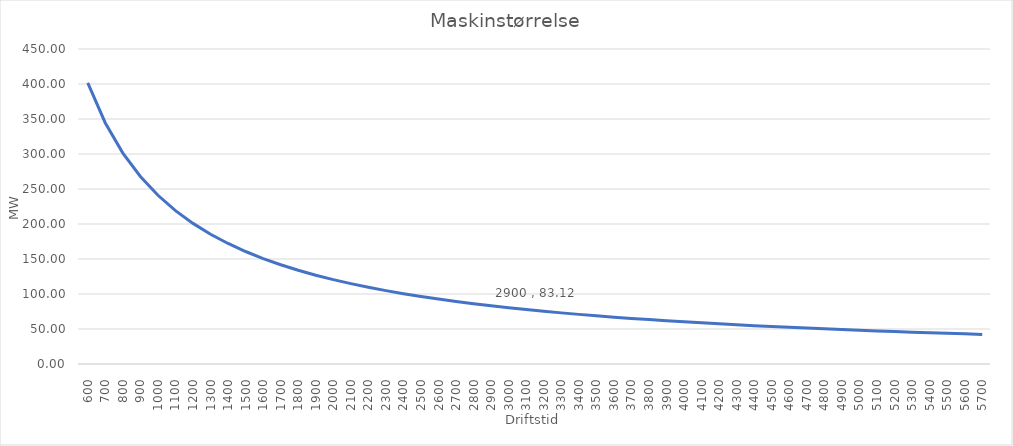
| Category | Maskinstørrelse |
|---|---|
| 600.0 | 401.742 |
| 700.0 | 344.35 |
| 800.0 | 301.306 |
| 900.0 | 267.828 |
| 1000.0 | 241.045 |
| 1100.0 | 219.132 |
| 1200.0 | 200.871 |
| 1300.0 | 185.419 |
| 1400.0 | 172.175 |
| 1500.0 | 160.697 |
| 1600.0 | 150.653 |
| 1700.0 | 141.791 |
| 1800.0 | 133.914 |
| 1900.0 | 126.866 |
| 2000.0 | 120.522 |
| 2100.0 | 114.783 |
| 2200.0 | 109.566 |
| 2300.0 | 104.802 |
| 2400.0 | 100.435 |
| 2500.0 | 96.418 |
| 2600.0 | 92.71 |
| 2700.0 | 89.276 |
| 2800.0 | 86.087 |
| 2900.0 | 83.119 |
| 3000.0 | 80.348 |
| 3100.0 | 77.756 |
| 3200.0 | 75.327 |
| 3300.0 | 73.044 |
| 3400.0 | 70.896 |
| 3500.0 | 68.87 |
| 3600.0 | 66.957 |
| 3700.0 | 65.147 |
| 3800.0 | 63.433 |
| 3900.0 | 61.806 |
| 4000.0 | 60.261 |
| 4100.0 | 58.791 |
| 4200.0 | 57.392 |
| 4300.0 | 56.057 |
| 4400.0 | 54.783 |
| 4500.0 | 53.566 |
| 4600.0 | 52.401 |
| 4700.0 | 51.286 |
| 4800.0 | 50.218 |
| 4900.0 | 49.193 |
| 5000.0 | 48.209 |
| 5100.0 | 47.264 |
| 5200.0 | 46.355 |
| 5300.0 | 45.48 |
| 5400.0 | 44.638 |
| 5500.0 | 43.826 |
| 5600.0 | 43.044 |
| 5700.0 | 42.289 |